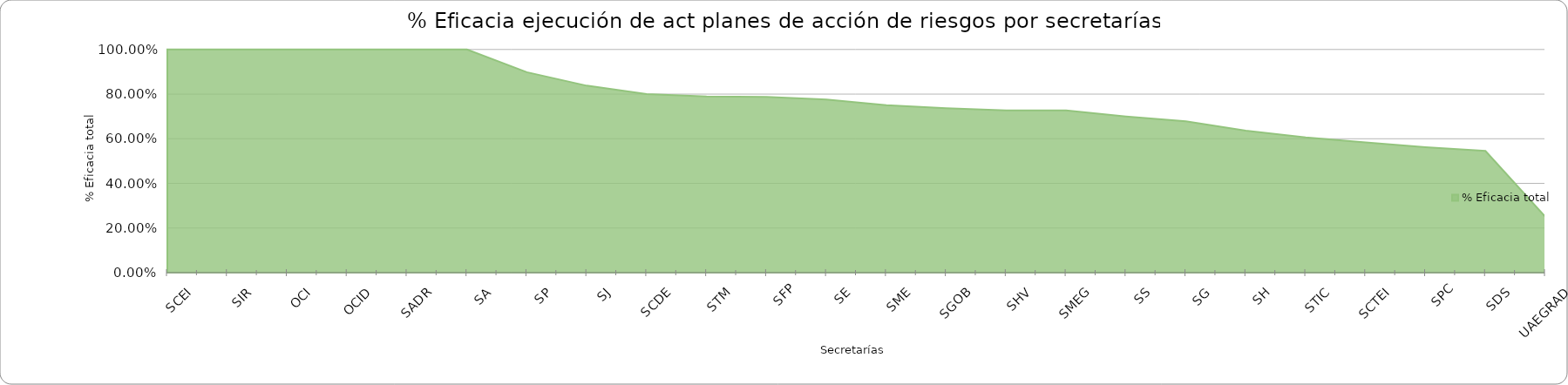
| Category | % Eficacia total |
|---|---|
| SCEI | 1 |
| SIR | 1 |
| OCI | 1 |
| OCID | 1 |
| SADR | 1 |
| SA | 1 |
| SP | 0.898 |
| SJ | 0.838 |
| SCDE | 0.8 |
| STM | 0.789 |
| SFP | 0.787 |
| SE | 0.776 |
| SME | 0.75 |
| SGOB | 0.737 |
| SHV | 0.727 |
| SMEG | 0.727 |
| SS | 0.7 |
| SG | 0.678 |
| SH | 0.636 |
| STIC | 0.606 |
| SCTEI | 0.583 |
| SPC | 0.562 |
| SDS | 0.545 |
| UAEGRAD | 0.25 |